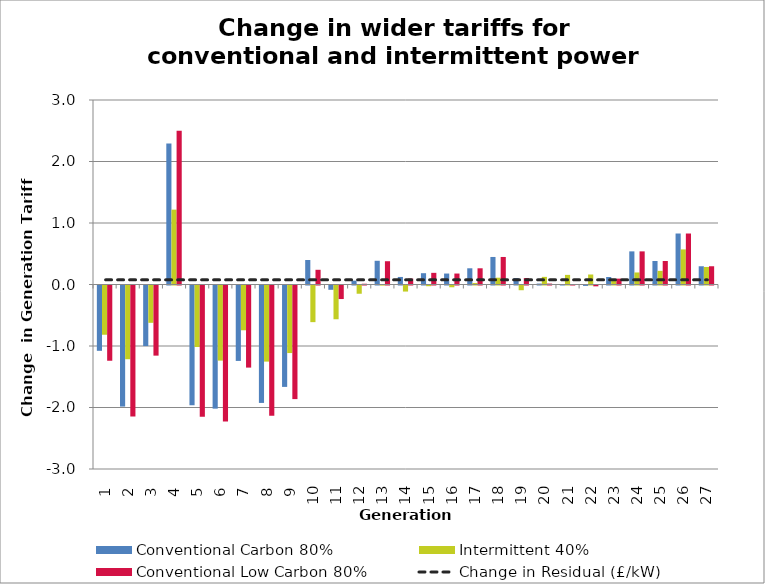
| Category | Conventional Carbon 80% | Intermittent 40% | Conventional Low Carbon 80% |
|---|---|---|---|
| 0 | -1.062 | -0.801 | -1.224 |
| 1 | -1.969 | -1.199 | -2.13 |
| 2 | -0.985 | -0.607 | -1.14 |
| 3 | 2.291 | 1.217 | 2.5 |
| 4 | -1.947 | -1 | -2.133 |
| 5 | -2.003 | -1.221 | -2.211 |
| 6 | -1.227 | -0.728 | -1.335 |
| 7 | -1.909 | -1.238 | -2.12 |
| 8 | -1.649 | -1.098 | -1.847 |
| 9 | 0.399 | -0.596 | 0.239 |
| 10 | -0.07 | -0.549 | -0.22 |
| 11 | 0.063 | -0.134 | 0.012 |
| 12 | 0.386 | -0.001 | 0.379 |
| 13 | 0.123 | -0.099 | 0.096 |
| 14 | 0.184 | -0.011 | 0.189 |
| 15 | 0.178 | -0.029 | 0.178 |
| 16 | 0.264 | 0.023 | 0.264 |
| 17 | 0.448 | 0.11 | 0.448 |
| 18 | 0.105 | -0.077 | 0.105 |
| 19 | 0.015 | 0.124 | 0.015 |
| 20 | 0 | 0.156 | 0 |
| 21 | -0.007 | 0.163 | -0.013 |
| 22 | 0.122 | 0.064 | 0.095 |
| 23 | 0.539 | 0.196 | 0.539 |
| 24 | 0.382 | 0.222 | 0.382 |
| 25 | 0.829 | 0.571 | 0.829 |
| 26 | 0.297 | 0.285 | 0.297 |